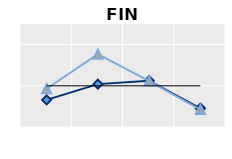
| Category | Né à l'étranger | Né dans le pays | Series 1 |
|---|---|---|---|
| 25-54 | 0.658 | 0.929 | 1 |
| 55-64 | 1.041 | 1.767 | 1 |
| 65+ | 1.123 | 1.116 | 1 |